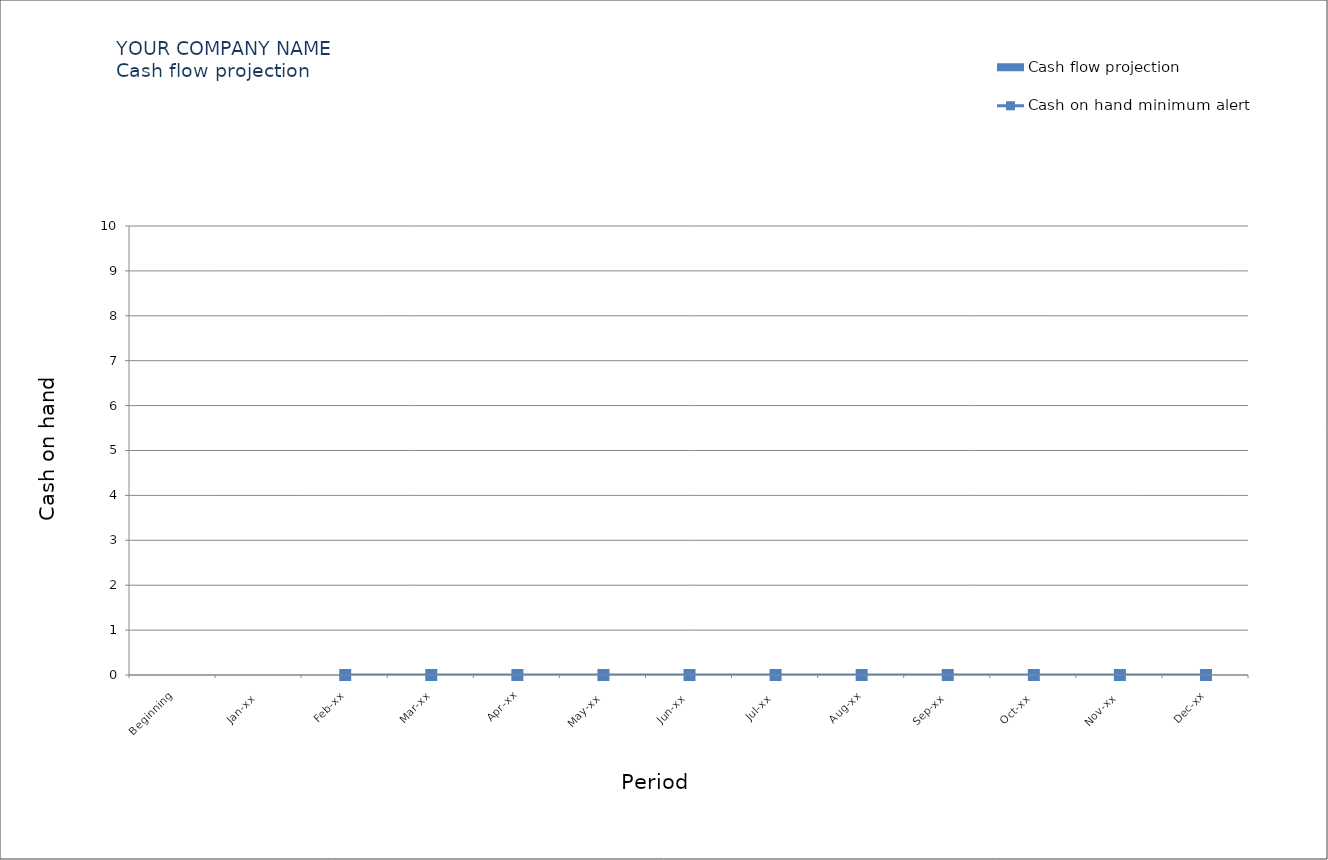
| Category | Cash flow projection |
|---|---|
| Beginning | 0 |
| Jan-xx | 0 |
| Feb-xx | 0 |
| Mar-xx | 0 |
| Apr-xx | 0 |
| May-xx | 0 |
| Jun-xx | 0 |
| Jul-xx | 0 |
| Aug-xx | 0 |
| Sep-xx | 0 |
| Oct-xx | 0 |
| Nov-xx | 0 |
| Dec-xx | 0 |